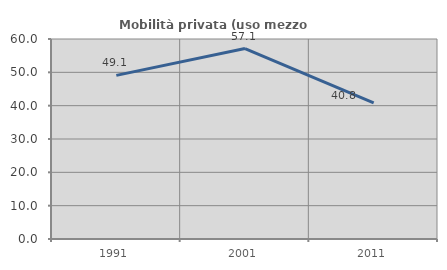
| Category | Mobilità privata (uso mezzo privato) |
|---|---|
| 1991.0 | 49.091 |
| 2001.0 | 57.143 |
| 2011.0 | 40.816 |